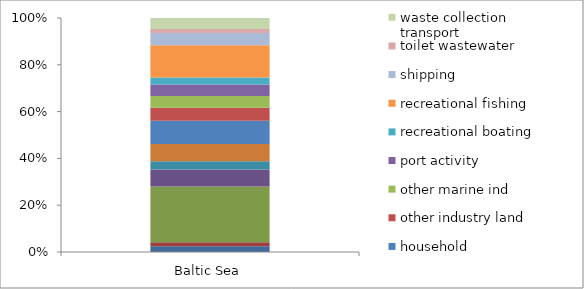
| Category | agriculture | aquaculture | coast beach tourism | construction and demolition | dumps and landfills | fishing | household | other industry land | other marine ind | port activity | recreational boating | recreational fishing | shipping | toilet wastewater | waste collection transport |
|---|---|---|---|---|---|---|---|---|---|---|---|---|---|---|---|
| Baltic Sea | 12594.5 | 8757.75 | 120616.25 | 37110 | 17418.75 | 37495.5 | 50401.5 | 28056.25 | 25624.5 | 24988.75 | 15404.5 | 69636.25 | 26660.25 | 8743.5 | 23729.5 |